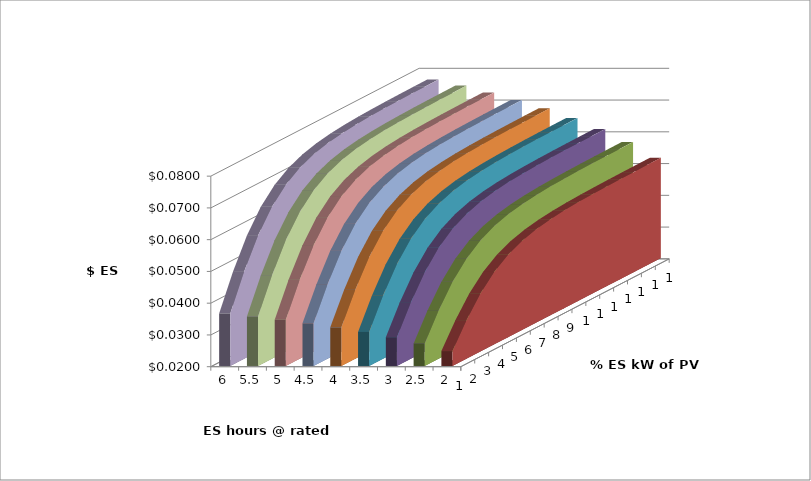
| Category | 2 | 2.5 | 3 | 3.5 | 4 | 4.5 | 5 | 5.5 | 6 |
|---|---|---|---|---|---|---|---|---|---|
| 0 | 0.025 | 0.027 | 0.029 | 0.031 | 0.032 | 0.033 | 0.035 | 0.036 | 0.037 |
| 1 | 0.032 | 0.035 | 0.038 | 0.04 | 0.042 | 0.043 | 0.045 | 0.046 | 0.047 |
| 2 | 0.038 | 0.042 | 0.045 | 0.048 | 0.05 | 0.052 | 0.053 | 0.055 | 0.057 |
| 3 | 0.043 | 0.047 | 0.05 | 0.053 | 0.056 | 0.058 | 0.06 | 0.062 | 0.063 |
| 4 | 0.046 | 0.05 | 0.054 | 0.057 | 0.06 | 0.062 | 0.064 | 0.066 | 0.068 |
| 5 | 0.048 | 0.053 | 0.057 | 0.06 | 0.063 | 0.065 | 0.067 | 0.069 | 0.071 |
| 6 | 0.049 | 0.054 | 0.058 | 0.061 | 0.064 | 0.067 | 0.069 | 0.071 | 0.073 |
| 7 | 0.05 | 0.055 | 0.059 | 0.062 | 0.065 | 0.068 | 0.07 | 0.072 | 0.074 |
| 8 | 0.051 | 0.056 | 0.06 | 0.063 | 0.066 | 0.069 | 0.071 | 0.073 | 0.075 |
| 9 | 0.051 | 0.056 | 0.06 | 0.064 | 0.066 | 0.069 | 0.071 | 0.074 | 0.076 |
| 10 | 0.051 | 0.056 | 0.06 | 0.064 | 0.067 | 0.069 | 0.072 | 0.074 | 0.076 |
| 11 | 0.051 | 0.056 | 0.06 | 0.064 | 0.067 | 0.07 | 0.072 | 0.074 | 0.076 |
| 12 | 0.051 | 0.056 | 0.061 | 0.064 | 0.067 | 0.07 | 0.072 | 0.074 | 0.076 |
| 13 | 0.052 | 0.057 | 0.061 | 0.064 | 0.067 | 0.07 | 0.072 | 0.074 | 0.076 |
| 14 | 0.052 | 0.057 | 0.061 | 0.064 | 0.067 | 0.07 | 0.072 | 0.074 | 0.076 |
| 15 | 0.052 | 0.057 | 0.061 | 0.064 | 0.067 | 0.07 | 0.072 | 0.074 | 0.076 |